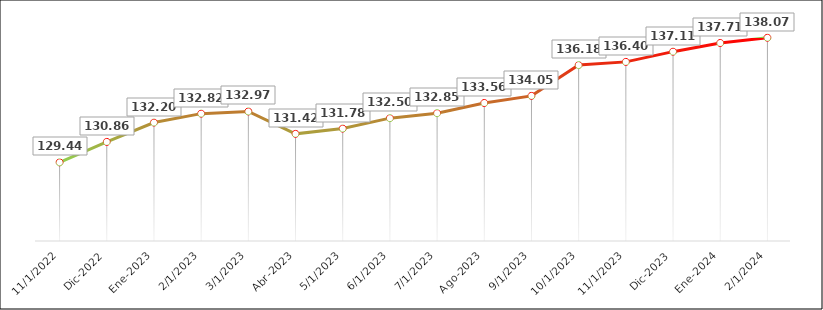
| Category | INPC |
|---|---|
| Nov-2022 | 129.448 |
| Dic-2022 | 130.865 |
| Ene-2023 | 132.204 |
| Feb-2023 | 132.822 |
| Mar-2023 | 132.972 |
| Abr-2023 | 131.422 |
| May-2023 | 131.787 |
| Jun-2023 | 132.509 |
| Jul-2023 | 132.855 |
| Ago-2023 | 133.561 |
| Sep-2023 | 134.053 |
| Oct-2023 | 136.184 |
| Nov-2023 | 136.407 |
| Dic-2023 | 137.115 |
| Ene-2024 | 137.716 |
| Feb-2024 | 138.079 |